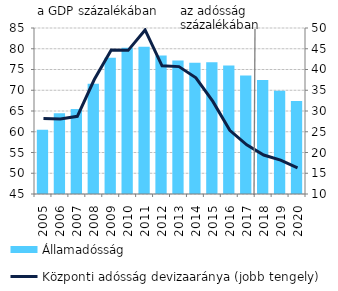
| Category | Államadósság |
|---|---|
| 2005.0 | 60.478 |
| 2006.0 | 64.456 |
| 2007.0 | 65.472 |
| 2008.0 | 71.581 |
| 2009.0 | 77.841 |
| 2010.0 | 80.248 |
| 2011.0 | 80.482 |
| 2012.0 | 78.373 |
| 2013.0 | 77.148 |
| 2014.0 | 76.63 |
| 2015.0 | 76.729 |
| 2016.0 | 75.98 |
| 2017.0 | 73.581 |
| 2018.0 | 72.44 |
| 2019.0 | 69.899 |
| 2020.0 | 67.421 |